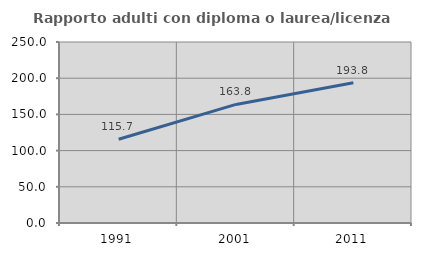
| Category | Rapporto adulti con diploma o laurea/licenza media  |
|---|---|
| 1991.0 | 115.658 |
| 2001.0 | 163.772 |
| 2011.0 | 193.75 |